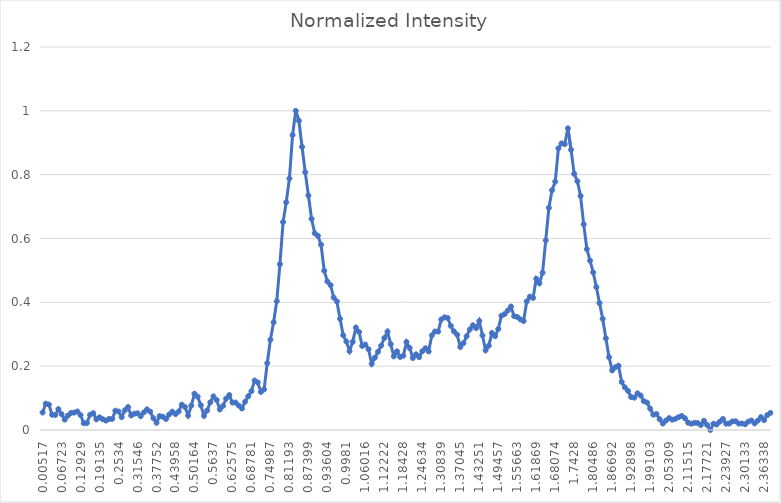
| Category | Normalized Intensity |
|---|---|
| 0.00517 | 0.055 |
| 0.01551 | 0.083 |
| 0.02586 | 0.08 |
| 0.0362 | 0.048 |
| 0.04654 | 0.047 |
| 0.05689 | 0.065 |
| 0.06723 | 0.05 |
| 0.07757 | 0.033 |
| 0.08792 | 0.045 |
| 0.09826 | 0.053 |
| 0.1086 | 0.055 |
| 0.11894 | 0.058 |
| 0.12929 | 0.047 |
| 0.13963 | 0.021 |
| 0.14997 | 0.022 |
| 0.16032 | 0.048 |
| 0.17066 | 0.053 |
| 0.181 | 0.033 |
| 0.19135 | 0.04 |
| 0.20169 | 0.034 |
| 0.21203 | 0.03 |
| 0.22238 | 0.034 |
| 0.23272 | 0.035 |
| 0.24306 | 0.06 |
| 0.2534 | 0.058 |
| 0.26375 | 0.04 |
| 0.27409 | 0.062 |
| 0.28443 | 0.072 |
| 0.29478 | 0.046 |
| 0.30512 | 0.051 |
| 0.31546 | 0.052 |
| 0.32581 | 0.043 |
| 0.33615 | 0.055 |
| 0.34649 | 0.065 |
| 0.35683 | 0.058 |
| 0.36718 | 0.037 |
| 0.37752 | 0.023 |
| 0.38786 | 0.044 |
| 0.39821 | 0.042 |
| 0.40855 | 0.035 |
| 0.41889 | 0.049 |
| 0.42924 | 0.058 |
| 0.43958 | 0.05 |
| 0.44992 | 0.058 |
| 0.46027 | 0.079 |
| 0.47061 | 0.072 |
| 0.48095 | 0.045 |
| 0.49129 | 0.076 |
| 0.50164 | 0.114 |
| 0.51198 | 0.104 |
| 0.52232 | 0.078 |
| 0.53267 | 0.044 |
| 0.54301 | 0.061 |
| 0.55335 | 0.087 |
| 0.5637 | 0.105 |
| 0.57404 | 0.094 |
| 0.58438 | 0.064 |
| 0.59472 | 0.075 |
| 0.60507 | 0.098 |
| 0.61541 | 0.109 |
| 0.62575 | 0.086 |
| 0.6361 | 0.086 |
| 0.64644 | 0.076 |
| 0.65678 | 0.067 |
| 0.66713 | 0.089 |
| 0.67747 | 0.106 |
| 0.68781 | 0.122 |
| 0.69815 | 0.155 |
| 0.7085 | 0.149 |
| 0.71884 | 0.119 |
| 0.72918 | 0.127 |
| 0.73953 | 0.209 |
| 0.74987 | 0.283 |
| 0.76021 | 0.338 |
| 0.77056 | 0.403 |
| 0.7809 | 0.519 |
| 0.79124 | 0.652 |
| 0.80159 | 0.714 |
| 0.81193 | 0.788 |
| 0.82227 | 0.924 |
| 0.83261 | 1 |
| 0.84296 | 0.969 |
| 0.8533 | 0.887 |
| 0.86364 | 0.808 |
| 0.87399 | 0.735 |
| 0.88433 | 0.662 |
| 0.89467 | 0.616 |
| 0.90502 | 0.608 |
| 0.91536 | 0.58 |
| 0.9257 | 0.499 |
| 0.93604 | 0.465 |
| 0.94639 | 0.454 |
| 0.95673 | 0.415 |
| 0.96707 | 0.403 |
| 0.97742 | 0.348 |
| 0.98776 | 0.297 |
| 0.9981 | 0.277 |
| 1.00845 | 0.247 |
| 1.01879 | 0.276 |
| 1.02913 | 0.321 |
| 1.03948 | 0.307 |
| 1.04982 | 0.264 |
| 1.06016 | 0.268 |
| 1.0705 | 0.253 |
| 1.08085 | 0.207 |
| 1.09119 | 0.227 |
| 1.10153 | 0.245 |
| 1.11188 | 0.264 |
| 1.12222 | 0.288 |
| 1.13256 | 0.308 |
| 1.14291 | 0.269 |
| 1.15325 | 0.231 |
| 1.16359 | 0.246 |
| 1.17393 | 0.229 |
| 1.18428 | 0.233 |
| 1.19462 | 0.276 |
| 1.20496 | 0.257 |
| 1.21531 | 0.226 |
| 1.22565 | 0.237 |
| 1.23599 | 0.228 |
| 1.24634 | 0.247 |
| 1.25668 | 0.256 |
| 1.26702 | 0.246 |
| 1.27737 | 0.296 |
| 1.28771 | 0.309 |
| 1.29805 | 0.308 |
| 1.30839 | 0.346 |
| 1.31874 | 0.353 |
| 1.32908 | 0.351 |
| 1.33942 | 0.326 |
| 1.34977 | 0.309 |
| 1.36011 | 0.299 |
| 1.37045 | 0.26 |
| 1.3808 | 0.272 |
| 1.39114 | 0.294 |
| 1.40148 | 0.315 |
| 1.41182 | 0.328 |
| 1.42217 | 0.319 |
| 1.43251 | 0.342 |
| 1.44285 | 0.296 |
| 1.4532 | 0.25 |
| 1.46354 | 0.264 |
| 1.47388 | 0.304 |
| 1.48423 | 0.294 |
| 1.49457 | 0.317 |
| 1.50491 | 0.358 |
| 1.51525 | 0.363 |
| 1.5256 | 0.374 |
| 1.53594 | 0.387 |
| 1.54628 | 0.357 |
| 1.55663 | 0.354 |
| 1.56697 | 0.346 |
| 1.57731 | 0.342 |
| 1.58766 | 0.403 |
| 1.598 | 0.418 |
| 1.60834 | 0.414 |
| 1.61869 | 0.474 |
| 1.62903 | 0.459 |
| 1.63937 | 0.493 |
| 1.64971 | 0.594 |
| 1.66006 | 0.696 |
| 1.6704 | 0.752 |
| 1.68074 | 0.778 |
| 1.69109 | 0.882 |
| 1.70143 | 0.898 |
| 1.71177 | 0.896 |
| 1.72212 | 0.945 |
| 1.73246 | 0.878 |
| 1.7428 | 0.802 |
| 1.75314 | 0.779 |
| 1.76349 | 0.733 |
| 1.77383 | 0.645 |
| 1.78417 | 0.567 |
| 1.79452 | 0.531 |
| 1.80486 | 0.494 |
| 1.8152 | 0.448 |
| 1.82555 | 0.398 |
| 1.83589 | 0.348 |
| 1.84623 | 0.287 |
| 1.85657 | 0.228 |
| 1.86692 | 0.187 |
| 1.87726 | 0.197 |
| 1.8876 | 0.201 |
| 1.89795 | 0.15 |
| 1.90829 | 0.134 |
| 1.91863 | 0.122 |
| 1.92898 | 0.103 |
| 1.93932 | 0.101 |
| 1.94966 | 0.115 |
| 1.96001 | 0.108 |
| 1.97035 | 0.09 |
| 1.98069 | 0.086 |
| 1.99103 | 0.067 |
| 2.00138 | 0.048 |
| 2.01172 | 0.05 |
| 2.02206 | 0.034 |
| 2.03241 | 0.02 |
| 2.04275 | 0.03 |
| 2.05309 | 0.037 |
| 2.06344 | 0.032 |
| 2.07378 | 0.035 |
| 2.08412 | 0.04 |
| 2.09446 | 0.044 |
| 2.10481 | 0.037 |
| 2.11515 | 0.023 |
| 2.12549 | 0.02 |
| 2.13584 | 0.023 |
| 2.14618 | 0.022 |
| 2.15652 | 0.016 |
| 2.16687 | 0.029 |
| 2.17721 | 0.016 |
| 2.18755 | 0 |
| 2.19789 | 0.02 |
| 2.20824 | 0.017 |
| 2.21858 | 0.026 |
| 2.22892 | 0.035 |
| 2.23927 | 0.02 |
| 2.24961 | 0.02 |
| 2.25995 | 0.027 |
| 2.2703 | 0.027 |
| 2.28064 | 0.02 |
| 2.29098 | 0.02 |
| 2.30133 | 0.018 |
| 2.31167 | 0.026 |
| 2.32201 | 0.03 |
| 2.33235 | 0.021 |
| 2.3427 | 0.029 |
| 2.35304 | 0.04 |
| 2.36338 | 0.031 |
| 2.37373 | 0.047 |
| 2.38407 | 0.054 |